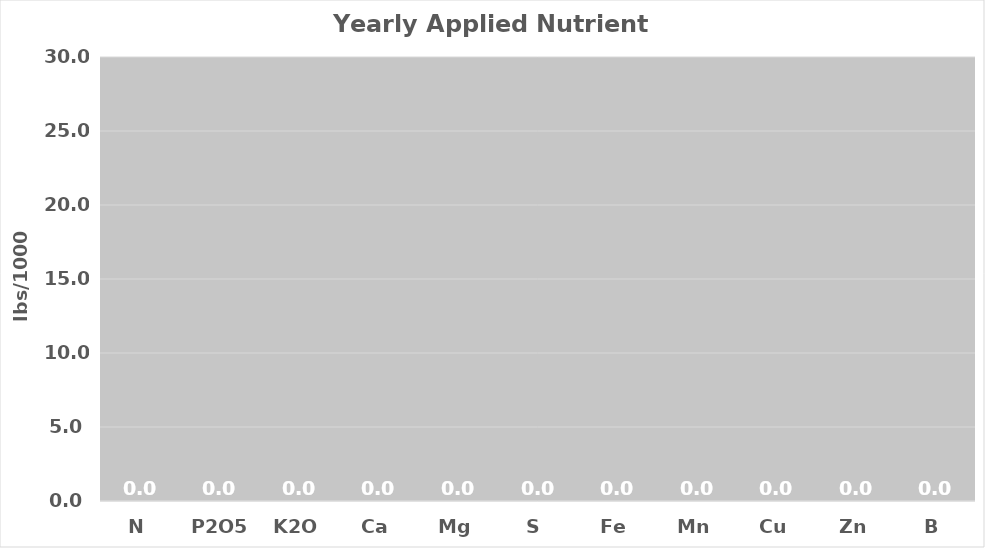
| Category | Yearly Applied Nutrient Totals |
|---|---|
| N | 0 |
| P2O5 | 0 |
| K2O | 0 |
| Ca | 0 |
| Mg | 0 |
| S | 0 |
| Fe | 0 |
| Mn | 0 |
| Cu | 0 |
| Zn | 0 |
| B | 0 |